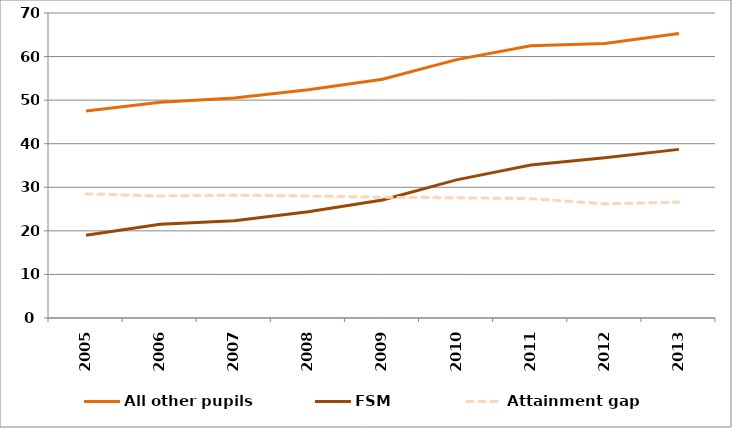
| Category | All other pupils | FSM | Attainment gap |
|---|---|---|---|
| 2005.0 | 47.5 | 19 | 28.5 |
| 2006.0 | 49.5 | 21.5 | 28 |
| 2007.0 | 50.5 | 22.3 | 28.2 |
| 2008.0 | 52.4 | 24.4 | 28 |
| 2009.0 | 54.8 | 27.1 | 27.7 |
| 2010.0 | 59.3 | 31.7 | 27.6 |
| 2011.0 | 62.5 | 35.1 | 27.4 |
| 2012.0 | 63 | 36.8 | 26.2 |
| 2013.0 | 65.3 | 38.7 | 26.6 |